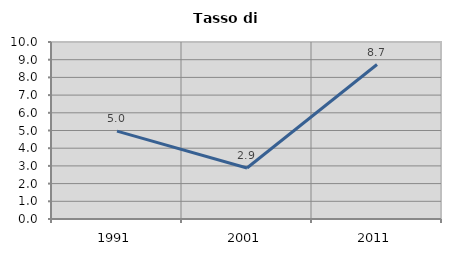
| Category | Tasso di disoccupazione   |
|---|---|
| 1991.0 | 4.968 |
| 2001.0 | 2.879 |
| 2011.0 | 8.727 |